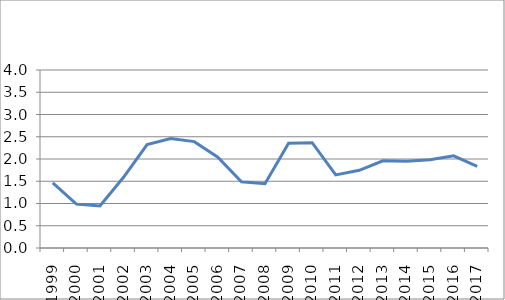
| Category | Anteil an 15- bis 64-jähriger Bevölkerung
in % |
|---|---|
| 1999.0 | 1.465 |
| 2000.0 | 0.989 |
| 2001.0 | 0.944 |
| 2002.0 | 1.588 |
| 2003.0 | 2.324 |
| 2004.0 | 2.462 |
| 2005.0 | 2.39 |
| 2006.0 | 2.042 |
| 2007.0 | 1.486 |
| 2008.0 | 1.446 |
| 2009.0 | 2.356 |
| 2010.0 | 2.367 |
| 2011.0 | 1.643 |
| 2012.0 | 1.746 |
| 2013.0 | 1.96 |
| 2014.0 | 1.949 |
| 2015.0 | 1.981 |
| 2016.0 | 2.071 |
| 2017.0 | 1.837 |